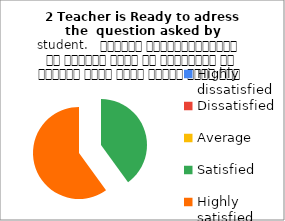
| Category | 2 Teacher is Ready to adress the  question asked by student.   शिक्षक विद्यार्थियों के द्वारा पूछे गए प्रश्नों का समाधान करने हेतु तत्पर रहते हैं |
|---|---|
| Highly dissatisfied | 0 |
| Dissatisfied | 0 |
| Average | 0 |
| Satisfied | 2 |
| Highly satisfied | 3 |